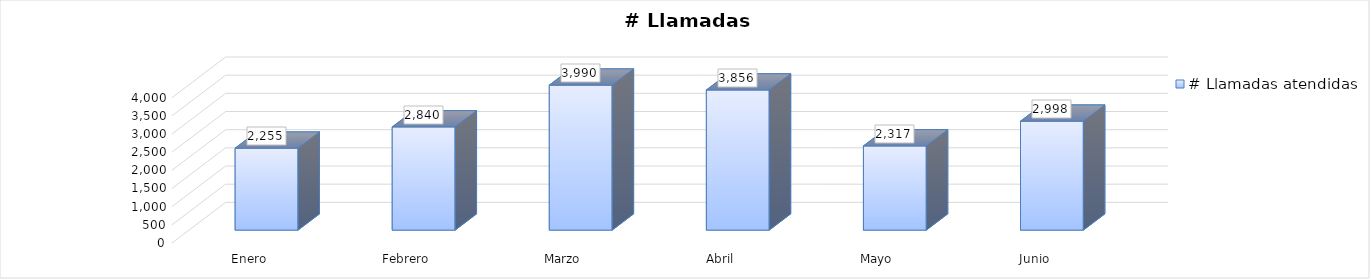
| Category | # Llamadas atendidas |
|---|---|
| Enero | 2255 |
| Febrero | 2840 |
| Marzo | 3990 |
| Abril | 3856 |
| Mayo | 2317 |
| Junio | 2998 |